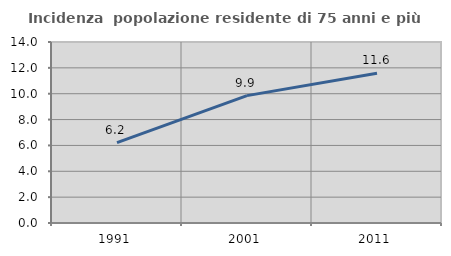
| Category | Incidenza  popolazione residente di 75 anni e più |
|---|---|
| 1991.0 | 6.222 |
| 2001.0 | 9.851 |
| 2011.0 | 11.589 |